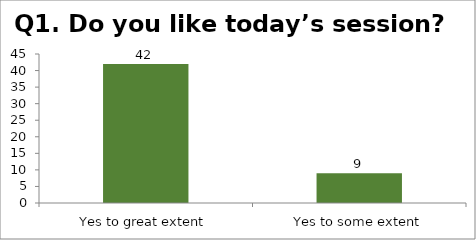
| Category | Q1. Do you like today’s session? |
|---|---|
| Yes to great extent | 42 |
| Yes to some extent | 9 |